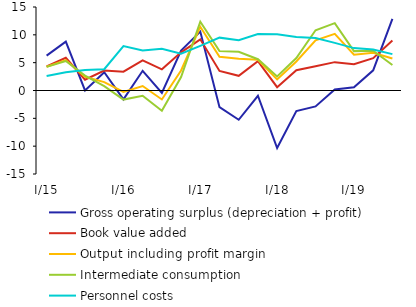
| Category | Gross operating surplus (depreciation + profit) | Book value added | Output including profit margin | Intermediate consumption | Personnel costs |
|---|---|---|---|---|---|
|  I/15 | 6.258 | 4.33 | 4.267 | 4.242 | 2.6 |
|  II | 8.779 | 5.885 | 5.463 | 5.302 | 3.274 |
| III | 0.02 | 1.943 | 2.472 | 2.674 | 3.683 |
| IV | 3.287 | 3.585 | 1.515 | 0.78 | 3.819 |
|  I/16 | -1.596 | 3.373 | -0.248 | -1.632 | 7.994 |
| II | 3.541 | 5.412 | 0.805 | -0.957 | 7.192 |
| III | -0.43 | 3.809 | -1.61 | -3.654 | 7.507 |
| IV | 7.176 | 6.856 | 3.599 | 2.411 | 6.605 |
|  I/17 | 10.577 | 9.191 | 11.446 | 12.351 | 8.017 |
| II | -2.998 | 3.514 | 6.043 | 7.072 | 9.495 |
| III | -5.256 | 2.64 | 5.707 | 6.955 | 9.023 |
| IV | -0.947 | 5.258 | 5.522 | 5.622 | 10.132 |
|  I/18 | -10.337 | 0.599 | 1.991 | 2.534 | 10.085 |
| II | -3.694 | 3.634 | 5.204 | 5.821 | 9.596 |
| III | -2.864 | 4.356 | 9.007 | 10.822 | 9.428 |
| IV | 0.198 | 5.094 | 10.18 | 12.11 | 8.553 |
|  I/19 | 0.588 | 4.705 | 6.418 | 7.074 | 7.614 |
| II | 3.63 | 5.81 | 6.783 | 7.157 | 7.369 |
| III | 12.878 | 8.972 | 5.753 | 4.57 | 6.536 |